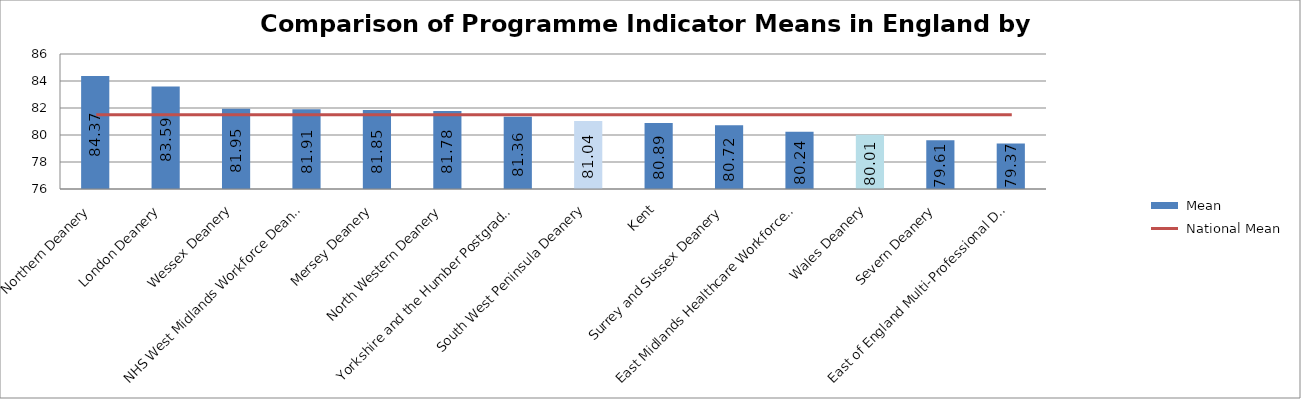
| Category |  Mean |
|---|---|
| Northern Deanery | 84.37 |
| London Deanery | 83.59 |
| Wessex Deanery | 81.95 |
| NHS West Midlands Workforce Deanery | 81.91 |
| Mersey Deanery | 81.85 |
| North Western Deanery | 81.78 |
| Yorkshire and the Humber Postgraduate Deanery | 81.36 |
| South West Peninsula Deanery | 81.04 |
| Kent, Surrey and Sussex Deanery | 80.89 |
| East Midlands Healthcare Workforce Deanery | 80.72 |
| Wales Deanery | 80.24 |
| Severn Deanery | 80.01 |
| East of England Multi-Professional Deanery | 79.61 |
| Oxford Deanery | 79.37 |